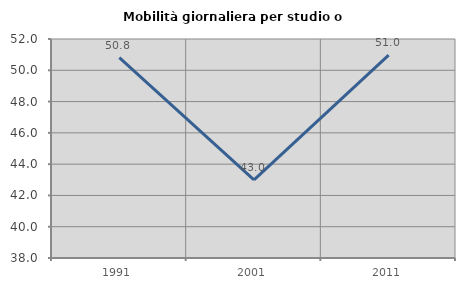
| Category | Mobilità giornaliera per studio o lavoro |
|---|---|
| 1991.0 | 50.813 |
| 2001.0 | 42.989 |
| 2011.0 | 50.971 |